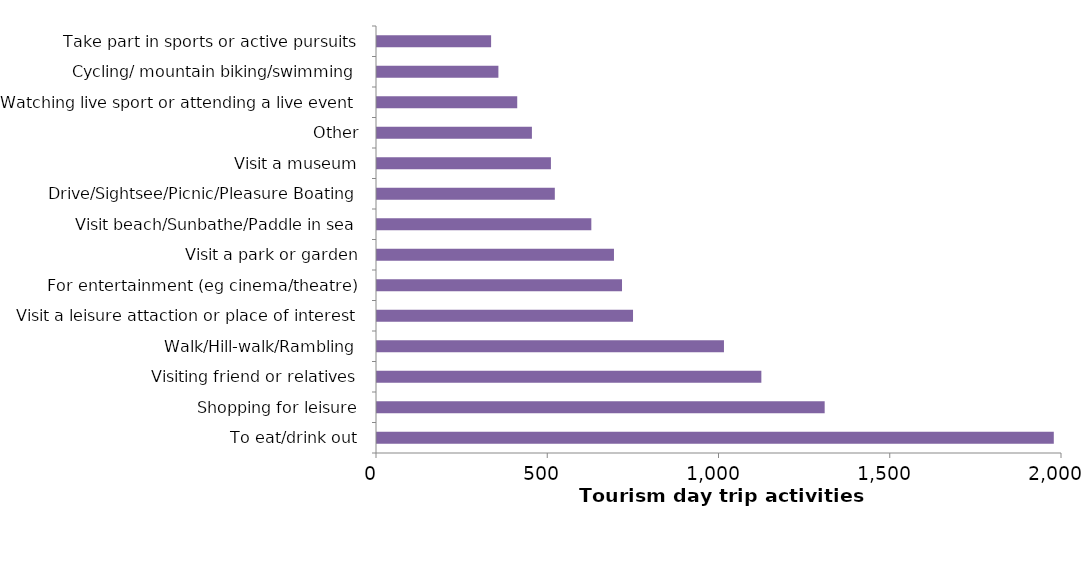
| Category | 2014 |
|---|---|
| To eat/drink out | 1976.054 |
| Shopping for leisure | 1307.082 |
| Visiting friend or relatives | 1122.195 |
| Walk/Hill-walk/Rambling | 1013.03 |
| Visit a leisure attaction or place of interest | 747.519 |
| For entertainment (eg cinema/theatre) | 715.359 |
| Visit a park or garden | 691.885 |
| Visit beach/Sunbathe/Paddle in sea | 625.777 |
| Drive/Sightsee/Picnic/Pleasure Boating | 519.181 |
| Visit a museum | 507.817 |
| Other | 452.296 |
| Watching live sport or attending a live event | 409.414 |
| Cycling/ mountain biking/swimming | 354.447 |
| Take part in sports or active pursuits | 333.154 |